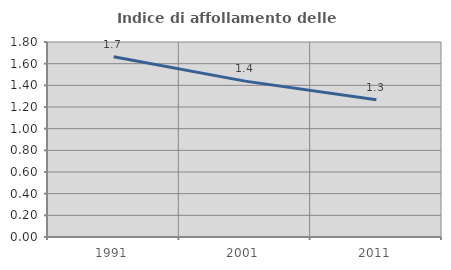
| Category | Indice di affollamento delle abitazioni  |
|---|---|
| 1991.0 | 1.664 |
| 2001.0 | 1.439 |
| 2011.0 | 1.267 |